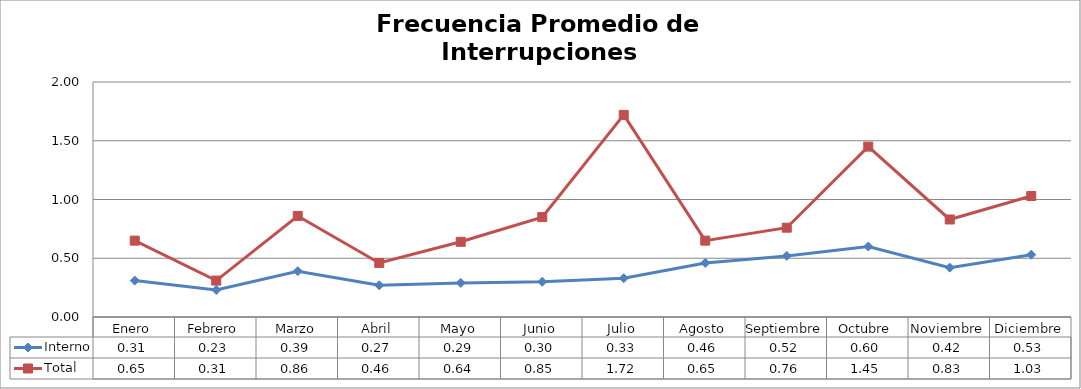
| Category | Interno | Total |
|---|---|---|
| Enero | 0.31 | 0.65 |
| Febrero | 0.23 | 0.31 |
| Marzo | 0.39 | 0.86 |
| Abril | 0.27 | 0.46 |
| Mayo | 0.29 | 0.64 |
| Junio | 0.3 | 0.85 |
| Julio | 0.33 | 1.72 |
| Agosto | 0.46 | 0.65 |
| Septiembre | 0.52 | 0.76 |
| Octubre | 0.6 | 1.45 |
| Noviembre | 0.42 | 0.83 |
| Diciembre | 0.53 | 1.03 |